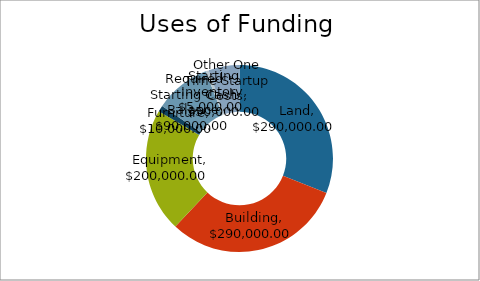
| Category | Uses of Funding |
|---|---|
| Land | 290000 |
| Building | 290000 |
| Equipment | 200000 |
| Furniture | 10000 |
| Required Starting Cash Balance | 90000 |
| Starting Inventory | 5000 |
| Other One Time Startup Costs | 50000 |